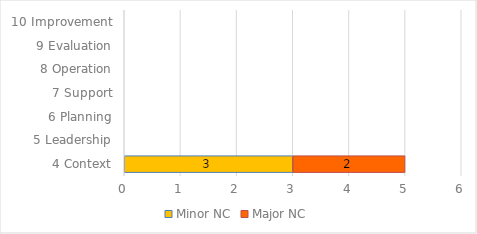
| Category | Minor NC | Major NC |
|---|---|---|
| 4 Context | 3 | 2 |
| 5 Leadership | 0 | 0 |
| 6 Planning | 0 | 0 |
| 7 Support | 0 | 0 |
| 8 Operation | 0 | 0 |
| 9 Evaluation | 0 | 0 |
| 10 Improvement | 0 | 0 |